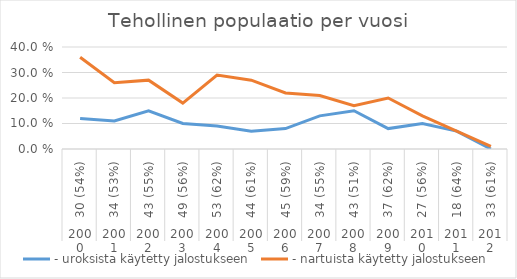
| Category | - uroksista käytetty jalostukseen | - nartuista käytetty jalostukseen |
|---|---|---|
| 0 | 0.12 | 0.36 |
| 1 | 0.11 | 0.26 |
| 2 | 0.15 | 0.27 |
| 3 | 0.1 | 0.18 |
| 4 | 0.09 | 0.29 |
| 5 | 0.07 | 0.27 |
| 6 | 0.08 | 0.22 |
| 7 | 0.13 | 0.21 |
| 8 | 0.15 | 0.17 |
| 9 | 0.08 | 0.2 |
| 10 | 0.1 | 0.13 |
| 11 | 0.07 | 0.07 |
| 12 | 0 | 0.01 |